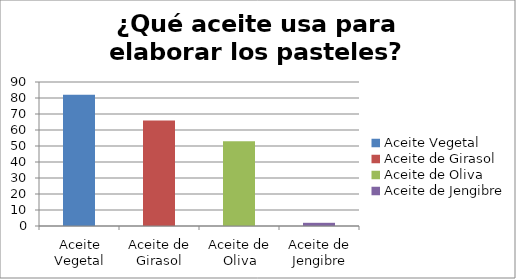
| Category | ¿Qué aceite usa para elaborar los pasteles? |
|---|---|
| Aceite Vegetal | 82 |
| Aceite de Girasol | 66 |
| Aceite de Oliva | 53 |
| Aceite de Jengibre | 2 |